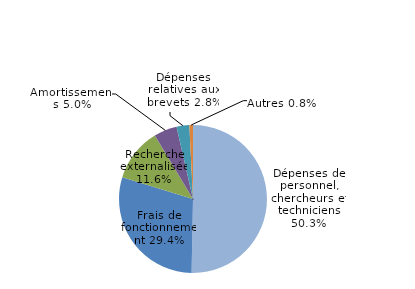
| Category | Series 0 |
|---|---|
| Dépenses de personnel, chercheurs et techniciens | 0.503 |
| Frais de fonctionnement | 0.294 |
| Recherche externalisée | 0.116 |
| Amortissements | 0.05 |
| Dépenses relatives aux brevets | 0.028 |
| Autres | 0.008 |